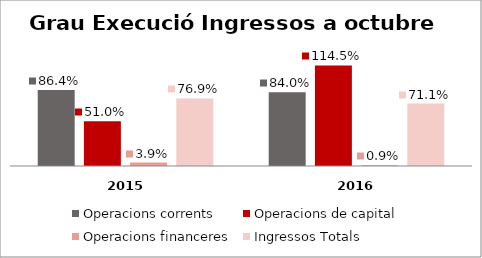
| Category | Operacions corrents | Operacions de capital | Operacions financeres | Ingressos Totals |
|---|---|---|---|---|
| 0 | 0.864 | 0.51 | 0.039 | 0.769 |
| 1 | 0.84 | 1.145 | 0.009 | 0.711 |